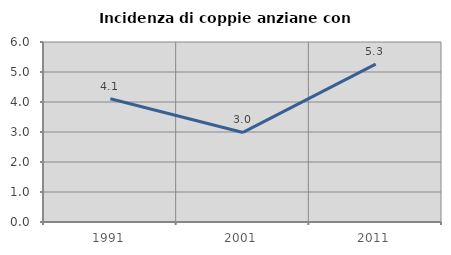
| Category | Incidenza di coppie anziane con figli |
|---|---|
| 1991.0 | 4.11 |
| 2001.0 | 2.985 |
| 2011.0 | 5.263 |